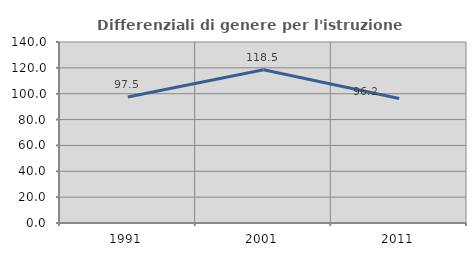
| Category | Differenziali di genere per l'istruzione superiore |
|---|---|
| 1991.0 | 97.454 |
| 2001.0 | 118.539 |
| 2011.0 | 96.247 |